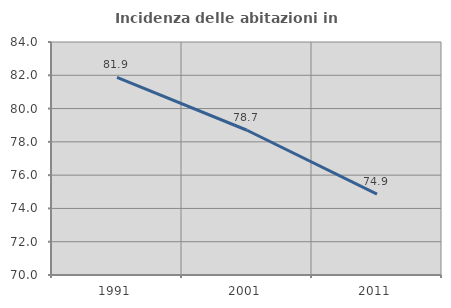
| Category | Incidenza delle abitazioni in proprietà  |
|---|---|
| 1991.0 | 81.879 |
| 2001.0 | 78.698 |
| 2011.0 | 74.863 |